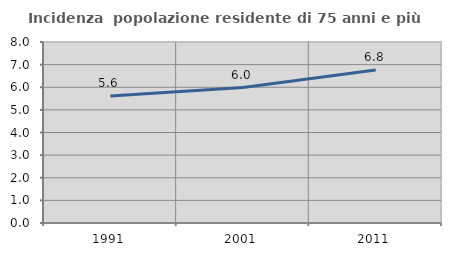
| Category | Incidenza  popolazione residente di 75 anni e più |
|---|---|
| 1991.0 | 5.617 |
| 2001.0 | 5.987 |
| 2011.0 | 6.759 |